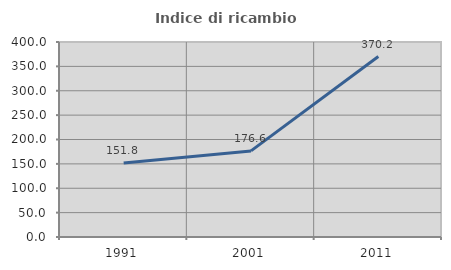
| Category | Indice di ricambio occupazionale  |
|---|---|
| 1991.0 | 151.754 |
| 2001.0 | 176.58 |
| 2011.0 | 370.213 |